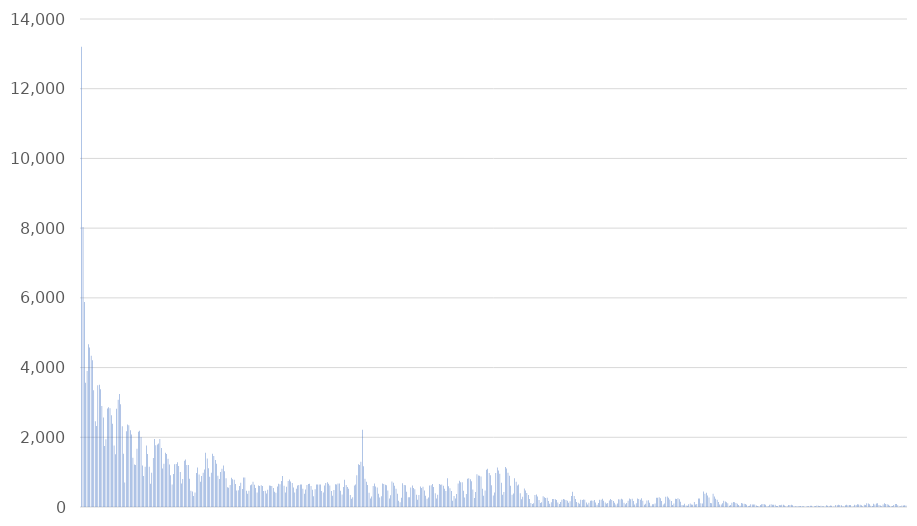
| Category | 16702 |
|---|---|
| 10/2/18 | 13202 |
| 10/3/18 | 8036 |
| 10/4/18 | 5880 |
| 10/5/18 | 3561 |
| 10/6/18 | 3905 |
| 10/7/18 | 4669 |
| 10/8/18 | 4578 |
| 10/9/18 | 4336 |
| 10/10/18 | 4209 |
| 10/11/18 | 3349 |
| 10/12/18 | 2459 |
| 10/13/18 | 2325 |
| 10/14/18 | 3492 |
| 10/15/18 | 3509 |
| 10/16/18 | 3381 |
| 10/17/18 | 2901 |
| 10/18/18 | 2567 |
| 10/19/18 | 1752 |
| 10/20/18 | 1941 |
| 10/21/18 | 2829 |
| 10/22/18 | 2859 |
| 10/23/18 | 2835 |
| 10/24/18 | 2630 |
| 10/25/18 | 2387 |
| 10/26/18 | 1763 |
| 10/27/18 | 1512 |
| 10/28/18 | 2820 |
| 10/29/18 | 3077 |
| 10/30/18 | 3240 |
| 10/31/18 | 2949 |
| 11/1/18 | 2316 |
| 11/2/18 | 1528 |
| 11/3/18 | 706 |
| 11/4/18 | 2172 |
| 11/5/18 | 2366 |
| 11/6/18 | 2343 |
| 11/7/18 | 2200 |
| 11/8/18 | 2080 |
| 11/9/18 | 1413 |
| 11/10/18 | 1218 |
| 11/11/18 | 1208 |
| 11/12/18 | 1671 |
| 11/13/18 | 2158 |
| 11/14/18 | 2184 |
| 11/15/18 | 2008 |
| 11/16/18 | 1187 |
| 11/17/18 | 891 |
| 11/18/18 | 1152 |
| 11/19/18 | 1767 |
| 11/20/18 | 1519 |
| 11/21/18 | 1155 |
| 11/22/18 | 665 |
| 11/23/18 | 985 |
| 11/24/18 | 1409 |
| 11/25/18 | 1950 |
| 11/26/18 | 1768 |
| 11/27/18 | 1791 |
| 11/28/18 | 1821 |
| 11/29/18 | 1948 |
| 11/30/18 | 1695 |
| 12/1/18 | 1101 |
| 12/2/18 | 1242 |
| 12/3/18 | 1558 |
| 12/4/18 | 1519 |
| 12/5/18 | 1385 |
| 12/6/18 | 1216 |
| 12/7/18 | 914 |
| 12/8/18 | 648 |
| 12/9/18 | 948 |
| 12/10/18 | 1226 |
| 12/11/18 | 1236 |
| 12/12/18 | 1282 |
| 12/13/18 | 1176 |
| 12/14/18 | 1001 |
| 12/15/18 | 673 |
| 12/16/18 | 805 |
| 12/17/18 | 1328 |
| 12/18/18 | 1360 |
| 12/19/18 | 1206 |
| 12/20/18 | 1202 |
| 12/21/18 | 808 |
| 12/22/18 | 467 |
| 12/23/18 | 448 |
| 12/24/18 | 317 |
| 12/25/18 | 416 |
| 12/26/18 | 973 |
| 12/27/18 | 1135 |
| 12/28/18 | 932 |
| 12/29/18 | 726 |
| 12/30/18 | 886 |
| 12/31/18 | 984 |
| 1/1/19 | 1076 |
| 1/2/19 | 1555 |
| 1/3/19 | 1393 |
| 1/4/19 | 1113 |
| 1/5/19 | 867 |
| 1/6/19 | 984 |
| 1/7/19 | 1525 |
| 1/8/19 | 1466 |
| 1/9/19 | 1351 |
| 1/10/19 | 1242 |
| 1/11/19 | 897 |
| 1/12/19 | 803 |
| 1/13/19 | 1006 |
| 1/14/19 | 1098 |
| 1/15/19 | 1194 |
| 1/16/19 | 1025 |
| 1/17/19 | 822 |
| 1/18/19 | 569 |
| 1/19/19 | 555 |
| 1/20/19 | 634 |
| 1/21/19 | 836 |
| 1/22/19 | 794 |
| 1/23/19 | 783 |
| 1/24/19 | 658 |
| 1/25/19 | 476 |
| 1/26/19 | 483 |
| 1/27/19 | 605 |
| 1/28/19 | 693 |
| 1/29/19 | 513 |
| 1/30/19 | 845 |
| 1/31/19 | 846 |
| 2/1/19 | 464 |
| 2/2/19 | 380 |
| 2/3/19 | 469 |
| 2/4/19 | 622 |
| 2/5/19 | 649 |
| 2/6/19 | 725 |
| 2/7/19 | 641 |
| 2/8/19 | 543 |
| 2/9/19 | 415 |
| 2/10/19 | 618 |
| 2/11/19 | 605 |
| 2/12/19 | 624 |
| 2/13/19 | 603 |
| 2/14/19 | 457 |
| 2/15/19 | 469 |
| 2/16/19 | 384 |
| 2/17/19 | 498 |
| 2/18/19 | 618 |
| 2/19/19 | 610 |
| 2/20/19 | 599 |
| 2/21/19 | 544 |
| 2/22/19 | 435 |
| 2/23/19 | 412 |
| 2/24/19 | 585 |
| 2/25/19 | 667 |
| 2/26/19 | 652 |
| 2/27/19 | 747 |
| 2/28/19 | 886 |
| 3/1/19 | 612 |
| 3/2/19 | 414 |
| 3/3/19 | 581 |
| 3/4/19 | 748 |
| 3/5/19 | 786 |
| 3/6/19 | 728 |
| 3/7/19 | 691 |
| 3/8/19 | 562 |
| 3/9/19 | 413 |
| 3/10/19 | 521 |
| 3/11/19 | 618 |
| 3/12/19 | 632 |
| 3/13/19 | 649 |
| 3/14/19 | 648 |
| 3/15/19 | 523 |
| 3/16/19 | 380 |
| 3/17/19 | 501 |
| 3/18/19 | 630 |
| 3/19/19 | 659 |
| 3/20/19 | 666 |
| 3/21/19 | 605 |
| 3/22/19 | 494 |
| 3/23/19 | 305 |
| 3/24/19 | 508 |
| 3/25/19 | 644 |
| 3/26/19 | 645 |
| 3/27/19 | 647 |
| 3/28/19 | 644 |
| 3/29/19 | 459 |
| 3/30/19 | 414 |
| 3/31/19 | 614 |
| 4/1/19 | 688 |
| 4/2/19 | 707 |
| 4/3/19 | 664 |
| 4/4/19 | 615 |
| 4/5/19 | 461 |
| 4/6/19 | 320 |
| 4/7/19 | 490 |
| 4/8/19 | 654 |
| 4/9/19 | 649 |
| 4/10/19 | 676 |
| 4/11/19 | 673 |
| 4/12/19 | 465 |
| 4/13/19 | 360 |
| 4/14/19 | 572 |
| 4/15/19 | 782 |
| 4/16/19 | 631 |
| 4/17/19 | 575 |
| 4/18/19 | 520 |
| 4/19/19 | 341 |
| 4/20/19 | 240 |
| 4/21/19 | 283 |
| 4/22/19 | 620 |
| 4/23/19 | 646 |
| 4/24/19 | 910 |
| 4/25/19 | 1230 |
| 4/26/19 | 1204 |
| 4/27/19 | 1298 |
| 4/28/19 | 2214 |
| 4/29/19 | 1171 |
| 4/30/19 | 814 |
| 5/1/19 | 726 |
| 5/2/19 | 629 |
| 5/3/19 | 412 |
| 5/4/19 | 246 |
| 5/5/19 | 302 |
| 5/6/19 | 599 |
| 5/7/19 | 672 |
| 5/8/19 | 590 |
| 5/9/19 | 559 |
| 5/10/19 | 380 |
| 5/11/19 | 273 |
| 5/12/19 | 307 |
| 5/13/19 | 674 |
| 5/14/19 | 661 |
| 5/15/19 | 640 |
| 5/16/19 | 627 |
| 5/17/19 | 475 |
| 5/18/19 | 241 |
| 5/19/19 | 340 |
| 5/20/19 | 730 |
| 5/21/19 | 695 |
| 5/22/19 | 610 |
| 5/23/19 | 526 |
| 5/24/19 | 377 |
| 5/25/19 | 178 |
| 5/26/19 | 139 |
| 5/27/19 | 262 |
| 5/28/19 | 681 |
| 5/29/19 | 631 |
| 5/30/19 | 625 |
| 5/31/19 | 435 |
| 6/1/19 | 282 |
| 6/2/19 | 281 |
| 6/3/19 | 557 |
| 6/4/19 | 617 |
| 6/5/19 | 547 |
| 6/6/19 | 509 |
| 6/7/19 | 350 |
| 6/8/19 | 206 |
| 6/9/19 | 343 |
| 6/10/19 | 590 |
| 6/11/19 | 542 |
| 6/12/19 | 581 |
| 6/13/19 | 476 |
| 6/14/19 | 322 |
| 6/15/19 | 240 |
| 6/16/19 | 272 |
| 6/17/19 | 614 |
| 6/18/19 | 624 |
| 6/19/19 | 658 |
| 6/20/19 | 576 |
| 6/21/19 | 395 |
| 6/22/19 | 244 |
| 6/23/19 | 348 |
| 6/24/19 | 661 |
| 6/25/19 | 637 |
| 6/26/19 | 648 |
| 6/27/19 | 609 |
| 6/28/19 | 526 |
| 6/29/19 | 461 |
| 6/30/19 | 823 |
| 7/1/19 | 596 |
| 7/2/19 | 537 |
| 7/3/19 | 456 |
| 7/4/19 | 178 |
| 7/5/19 | 318 |
| 7/6/19 | 243 |
| 7/7/19 | 370 |
| 7/8/19 | 671 |
| 7/9/19 | 755 |
| 7/10/19 | 707 |
| 7/11/19 | 710 |
| 7/12/19 | 466 |
| 7/13/19 | 269 |
| 7/14/19 | 372 |
| 7/15/19 | 811 |
| 7/16/19 | 827 |
| 7/17/19 | 795 |
| 7/18/19 | 736 |
| 7/19/19 | 500 |
| 7/20/19 | 258 |
| 7/21/19 | 428 |
| 7/22/19 | 936 |
| 7/23/19 | 902 |
| 7/24/19 | 893 |
| 7/25/19 | 872 |
| 7/26/19 | 526 |
| 7/27/19 | 326 |
| 7/28/19 | 476 |
| 7/29/19 | 1066 |
| 7/30/19 | 1094 |
| 7/31/19 | 972 |
| 8/1/19 | 914 |
| 8/2/19 | 624 |
| 8/3/19 | 329 |
| 8/4/19 | 416 |
| 8/5/19 | 977 |
| 8/6/19 | 1134 |
| 8/7/19 | 1049 |
| 8/8/19 | 953 |
| 8/9/19 | 698 |
| 8/10/19 | 348 |
| 8/11/19 | 428 |
| 8/12/19 | 1146 |
| 8/13/19 | 1106 |
| 8/14/19 | 979 |
| 8/15/19 | 899 |
| 8/16/19 | 611 |
| 8/17/19 | 349 |
| 8/18/19 | 390 |
| 8/19/19 | 824 |
| 8/20/19 | 725 |
| 8/21/19 | 619 |
| 8/22/19 | 648 |
| 8/23/19 | 391 |
| 8/24/19 | 221 |
| 8/25/19 | 291 |
| 8/26/19 | 530 |
| 8/27/19 | 474 |
| 8/28/19 | 405 |
| 8/29/19 | 347 |
| 8/30/19 | 228 |
| 8/31/19 | 113 |
| 9/1/19 | 86 |
| 9/2/19 | 108 |
| 9/3/19 | 344 |
| 9/4/19 | 361 |
| 9/5/19 | 298 |
| 9/6/19 | 204 |
| 9/7/19 | 113 |
| 9/8/19 | 136 |
| 9/9/19 | 308 |
| 9/10/19 | 280 |
| 9/11/19 | 260 |
| 9/12/19 | 267 |
| 9/13/19 | 172 |
| 9/14/19 | 91 |
| 9/15/19 | 137 |
| 9/16/19 | 228 |
| 9/17/19 | 229 |
| 9/18/19 | 224 |
| 9/19/19 | 199 |
| 9/20/19 | 130 |
| 9/21/19 | 85 |
| 9/22/19 | 141 |
| 9/23/19 | 209 |
| 9/24/19 | 233 |
| 9/25/19 | 217 |
| 9/26/19 | 202 |
| 9/27/19 | 178 |
| 9/28/19 | 122 |
| 9/29/19 | 162 |
| 9/30/19 | 316 |
| 10/1/19 | 439 |
| 10/2/19 | 315 |
| 10/3/19 | 233 |
| 10/4/19 | 141 |
| 10/5/19 | 122 |
| 10/6/19 | 94 |
| 10/7/19 | 207 |
| 10/8/19 | 200 |
| 10/9/19 | 213 |
| 10/10/19 | 207 |
| 10/11/19 | 128 |
| 10/12/19 | 73 |
| 10/13/19 | 123 |
| 10/14/19 | 182 |
| 10/15/19 | 184 |
| 10/16/19 | 179 |
| 10/17/19 | 201 |
| 10/18/19 | 132 |
| 10/19/19 | 61 |
| 10/20/19 | 113 |
| 10/21/19 | 205 |
| 10/22/19 | 206 |
| 10/23/19 | 235 |
| 10/24/19 | 176 |
| 10/25/19 | 127 |
| 10/26/19 | 91 |
| 10/27/19 | 118 |
| 10/28/19 | 189 |
| 10/29/19 | 228 |
| 10/30/19 | 203 |
| 10/31/19 | 174 |
| 11/1/19 | 122 |
| 11/2/19 | 74 |
| 11/3/19 | 103 |
| 11/4/19 | 220 |
| 11/5/19 | 213 |
| 11/6/19 | 238 |
| 11/7/19 | 216 |
| 11/8/19 | 123 |
| 11/9/19 | 76 |
| 11/10/19 | 115 |
| 11/11/19 | 177 |
| 11/12/19 | 243 |
| 11/13/19 | 220 |
| 11/14/19 | 240 |
| 11/15/19 | 174 |
| 11/16/19 | 69 |
| 11/17/19 | 105 |
| 11/18/19 | 245 |
| 11/19/19 | 226 |
| 11/20/19 | 208 |
| 11/21/19 | 252 |
| 11/22/19 | 177 |
| 11/23/19 | 61 |
| 11/24/19 | 92 |
| 11/25/19 | 187 |
| 11/26/19 | 196 |
| 11/27/19 | 125 |
| 11/28/19 | 38 |
| 11/29/19 | 76 |
| 11/30/19 | 78 |
| 12/1/19 | 102 |
| 12/2/19 | 263 |
| 12/3/19 | 264 |
| 12/4/19 | 279 |
| 12/5/19 | 249 |
| 12/6/19 | 174 |
| 12/7/19 | 74 |
| 12/8/19 | 97 |
| 12/9/19 | 291 |
| 12/10/19 | 303 |
| 12/11/19 | 266 |
| 12/12/19 | 217 |
| 12/13/19 | 170 |
| 12/14/19 | 58 |
| 12/15/19 | 99 |
| 12/16/19 | 234 |
| 12/17/19 | 226 |
| 12/18/19 | 248 |
| 12/19/19 | 220 |
| 12/20/19 | 152 |
| 12/21/19 | 54 |
| 12/22/19 | 51 |
| 12/23/19 | 93 |
| 12/24/19 | 43 |
| 12/25/19 | 39 |
| 12/26/19 | 79 |
| 12/27/19 | 99 |
| 12/28/19 | 71 |
| 12/29/19 | 64 |
| 12/30/19 | 144 |
| 12/31/19 | 71 |
| 1/1/20 | 84 |
| 1/2/20 | 242 |
| 1/3/20 | 245 |
| 1/4/20 | 109 |
| 1/5/20 | 101 |
| 1/6/20 | 442 |
| 1/7/20 | 383 |
| 1/8/20 | 410 |
| 1/9/20 | 333 |
| 1/10/20 | 271 |
| 1/11/20 | 118 |
| 1/12/20 | 111 |
| 1/13/20 | 381 |
| 1/14/20 | 302 |
| 1/15/20 | 235 |
| 1/16/20 | 210 |
| 1/17/20 | 147 |
| 1/18/20 | 73 |
| 1/19/20 | 69 |
| 1/20/20 | 110 |
| 1/21/20 | 176 |
| 1/22/20 | 159 |
| 1/23/20 | 133 |
| 1/24/20 | 106 |
| 1/25/20 | 35 |
| 1/26/20 | 60 |
| 1/27/20 | 124 |
| 1/28/20 | 143 |
| 1/29/20 | 133 |
| 1/30/20 | 114 |
| 1/31/20 | 90 |
| 2/1/20 | 55 |
| 2/2/20 | 34 |
| 2/3/20 | 116 |
| 2/4/20 | 99 |
| 2/5/20 | 94 |
| 2/6/20 | 87 |
| 2/7/20 | 68 |
| 2/8/20 | 31 |
| 2/9/20 | 34 |
| 2/10/20 | 81 |
| 2/11/20 | 73 |
| 2/12/20 | 71 |
| 2/13/20 | 75 |
| 2/14/20 | 43 |
| 2/15/20 | 29 |
| 2/16/20 | 24 |
| 2/17/20 | 54 |
| 2/18/20 | 79 |
| 2/19/20 | 85 |
| 2/20/20 | 77 |
| 2/21/20 | 61 |
| 2/22/20 | 20 |
| 2/23/20 | 25 |
| 2/24/20 | 63 |
| 2/25/20 | 78 |
| 2/26/20 | 65 |
| 2/27/20 | 67 |
| 2/28/20 | 62 |
| 2/29/20 | 29 |
| 3/1/20 | 31 |
| 3/2/20 | 57 |
| 3/3/20 | 53 |
| 3/4/20 | 68 |
| 3/5/20 | 62 |
| 3/6/20 | 42 |
| 3/7/20 | 20 |
| 3/8/20 | 17 |
| 3/9/20 | 60 |
| 3/10/20 | 55 |
| 3/11/20 | 64 |
| 3/12/20 | 47 |
| 3/13/20 | 22 |
| 3/14/20 | 20 |
| 3/15/20 | 12 |
| 3/16/20 | 27 |
| 3/17/20 | 24 |
| 3/18/20 | 27 |
| 3/19/20 | 28 |
| 3/20/20 | 22 |
| 3/21/20 | 6 |
| 3/22/20 | 15 |
| 3/23/20 | 25 |
| 3/24/20 | 28 |
| 3/25/20 | 39 |
| 3/26/20 | 33 |
| 3/27/20 | 17 |
| 3/28/20 | 24 |
| 3/29/20 | 26 |
| 3/30/20 | 43 |
| 3/31/20 | 34 |
| 4/1/20 | 27 |
| 4/2/20 | 34 |
| 4/3/20 | 25 |
| 4/4/20 | 18 |
| 4/5/20 | 17 |
| 4/6/20 | 47 |
| 4/7/20 | 39 |
| 4/8/20 | 32 |
| 4/9/20 | 43 |
| 4/10/20 | 37 |
| 4/11/20 | 17 |
| 4/12/20 | 10 |
| 4/13/20 | 56 |
| 4/14/20 | 48 |
| 4/15/20 | 66 |
| 4/16/20 | 58 |
| 4/17/20 | 50 |
| 4/18/20 | 16 |
| 4/19/20 | 20 |
| 4/20/20 | 50 |
| 4/21/20 | 65 |
| 4/22/20 | 51 |
| 4/23/20 | 56 |
| 4/24/20 | 55 |
| 4/25/20 | 16 |
| 4/26/20 | 17 |
| 4/27/20 | 61 |
| 4/28/20 | 57 |
| 4/29/20 | 77 |
| 4/30/20 | 75 |
| 5/1/20 | 63 |
| 5/2/20 | 48 |
| 5/3/20 | 20 |
| 5/4/20 | 65 |
| 5/5/20 | 60 |
| 5/6/20 | 109 |
| 5/7/20 | 102 |
| 5/8/20 | 82 |
| 5/9/20 | 34 |
| 5/10/20 | 26 |
| 5/11/20 | 94 |
| 5/12/20 | 75 |
| 5/13/20 | 97 |
| 5/14/20 | 104 |
| 5/15/20 | 60 |
| 5/16/20 | 42 |
| 5/17/20 | 19 |
| 5/18/20 | 72 |
| 5/19/20 | 104 |
| 5/20/20 | 89 |
| 5/21/20 | 80 |
| 5/22/20 | 67 |
| 5/23/20 | 35 |
| 5/24/20 | 18 |
| 5/25/20 | 28 |
| 5/26/20 | 58 |
| 5/27/20 | 84 |
| 5/28/20 | 89 |
| 5/29/20 | 53 |
| 5/30/20 | 16 |
| 5/31/20 | 18 |
| 6/1/20 | 40 |
| 6/2/20 | 46 |
| 6/3/20 | 47 |
| 6/4/20 | 46 |
| 6/5/20 | 1 |